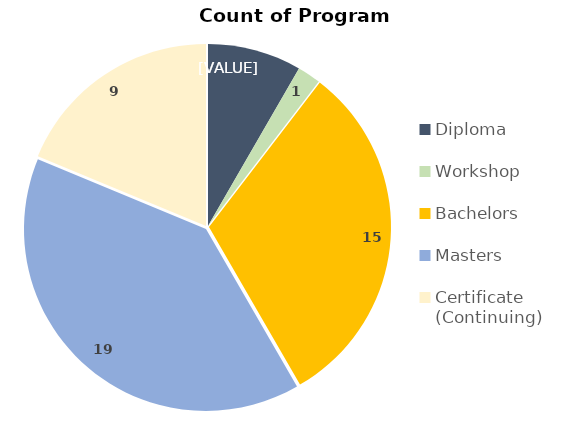
| Category | Series 0 |
|---|---|
| Diploma | 4 |
| Workshop | 1 |
| Bachelors | 15 |
| Masters | 19 |
| Certificate (Continuing) | 9 |